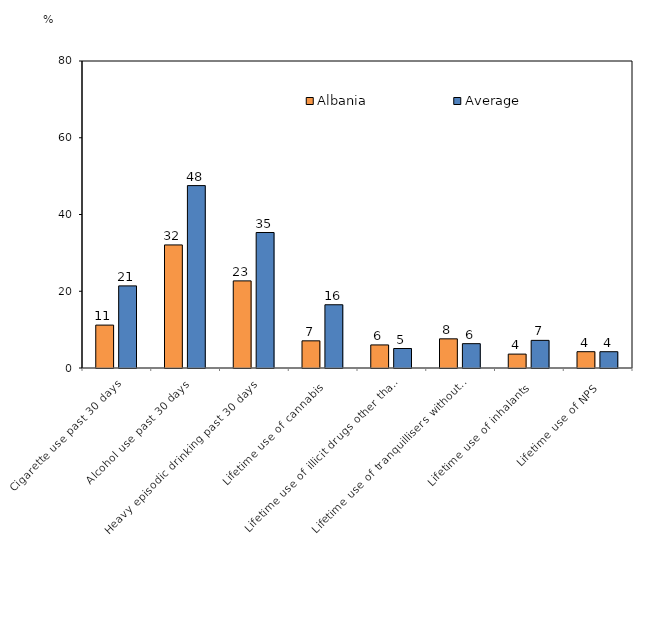
| Category | Albania | Average |
|---|---|---|
| Cigarette use past 30 days | 11.18 | 21.397 |
| Alcohol use past 30 days | 32.07 | 47.531 |
| Heavy episodic drinking past 30 days | 22.7 | 35.309 |
| Lifetime use of cannabis | 7.08 | 16.48 |
| Lifetime use of illicit drugs other than cannabis | 6.01 | 5.079 |
| Lifetime use of tranquillisers without prescription  | 7.6 | 6.34 |
| Lifetime use of inhalants | 3.62 | 7.202 |
| Lifetime use of NPS | 4.25 | 4.246 |